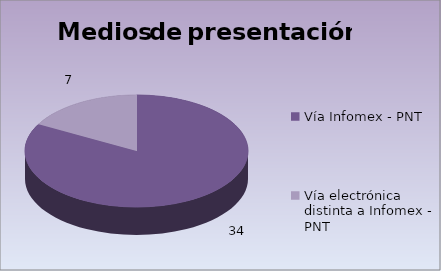
| Category | Series 0 |
|---|---|
| Vía Infomex - PNT | 34 |
| Vía electrónica distinta a Infomex - PNT | 7 |